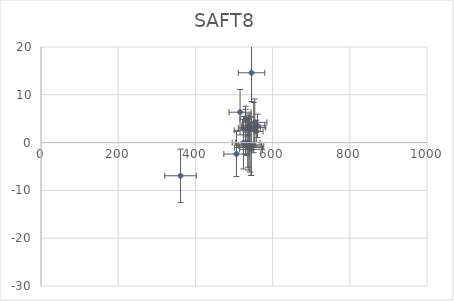
| Category | SAFT8 |
|---|---|
| 506.29704420983944 | -2.384 |
| 361.5396656349641 | -6.94 |
| 524.4955222387176 | -0.037 |
| 529.7114267328599 | 2.579 |
| 536.8590473356811 | -1.027 |
| 544.7291263440942 | -0.738 |
| 544.2240984101572 | -1.415 |
| 553.7585541948974 | 4.243 |
| 535.765342857133 | 0.01 |
| 515.7518279733307 | 6.358 |
| 551.0975387091058 | 3.13 |
| 545.4395206889169 | 14.607 |
| 540.874146382378 | -0.479 |
| 531.1101068472684 | -0.537 |
| 557.8583794137107 | 2.335 |
| 534.3721584189301 | 3.192 |
| 560.7330979295488 | 3.498 |
| 530.0038730922646 | 4.898 |
| 537.9094544778036 | 3.629 |
| 539.6891021095585 | 3.069 |
| 539.9221873795249 | 2.849 |